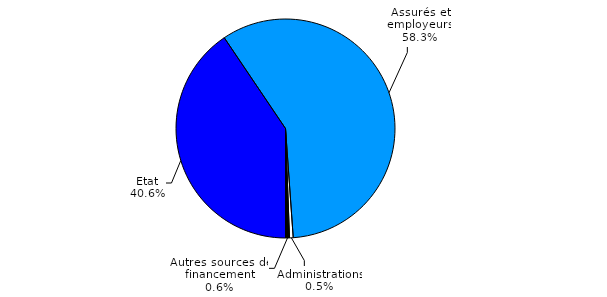
| Category | Series 0 |
|---|---|
| Etat | 1585.753 |
| Assurés et employeurs | 2280.534 |
| Administrations | 21.301 |
| Autres sources de financement | 22.718 |